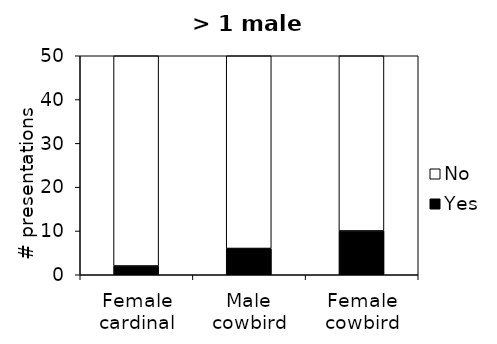
| Category | Yes | No |
|---|---|---|
| Female cardinal | 2 | 48 |
| Male cowbird | 6 | 44 |
| Female cowbird | 10 | 40 |